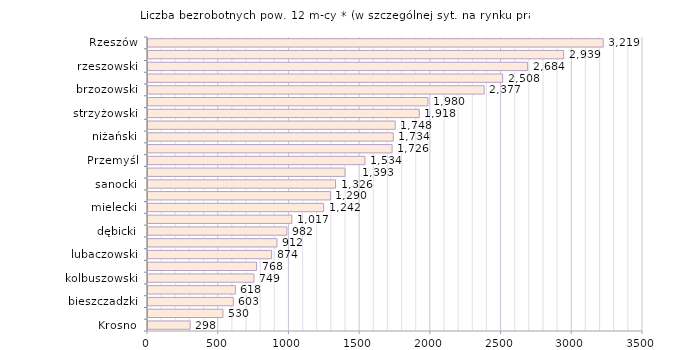
| Category | Liczba bezrobotnych powyżej 12 miesięcy* - w szczególnej sytuacji na rynku pracy |
|---|---|
| Krosno | 298 |
| Tarnobrzeg | 530 |
| bieszczadzki | 603 |
| tarnobrzeski  | 618 |
| kolbuszowski | 749 |
| stalowowolski | 768 |
| lubaczowski | 874 |
| krośnieński | 912 |
| dębicki | 982 |
| leski | 1017 |
| mielecki | 1242 |
| łańcucki | 1290 |
| sanocki | 1326 |
| ropczycko-sędziszowski | 1393 |
| Przemyśl | 1534 |
| przemyski | 1726 |
| niżański | 1734 |
| leżajski | 1748 |
| strzyżowski | 1918 |
| przeworski | 1980 |
| brzozowski | 2377 |
| jarosławski | 2508 |
| rzeszowski | 2684 |
| jasielski | 2939 |
| Rzeszów | 3219 |